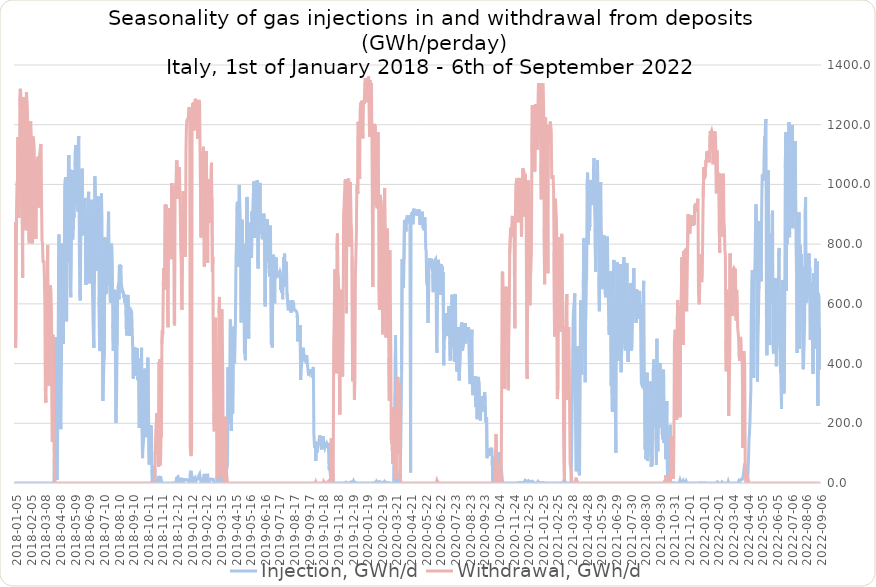
| Category | Injection, GWh/d | Withdrawal, GWh/d |
|---|---|---|
| 2022-09-06 | 522 | 0 |
| 2022-09-05 | 380.31 | 0 |
| 2022-09-04 | 624.36 | 0 |
| 2022-09-03 | 636.69 | 0 |
| 2022-09-02 | 258.62 | 0 |
| 2022-09-01 | 741.74 | 0 |
| 2022-08-31 | 582.03 | 0 |
| 2022-08-30 | 633.62 | 0 |
| 2022-08-29 | 450.82 | 0 |
| 2022-08-28 | 751.25 | 0 |
| 2022-08-27 | 535.9 | 0 |
| 2022-08-26 | 509.53 | 1.1 |
| 2022-08-25 | 571.39 | 0 |
| 2022-08-24 | 702.57 | 0 |
| 2022-08-23 | 365.87 | 0 |
| 2022-08-22 | 397.51 | 0 |
| 2022-08-21 | 633.88 | 0 |
| 2022-08-20 | 581.63 | 0 |
| 2022-08-19 | 671.22 | 0 |
| 2022-08-18 | 580.53 | 0 |
| 2022-08-17 | 478.66 | 0 |
| 2022-08-16 | 720.75 | 0 |
| 2022-08-15 | 712.52 | 0 |
| 2022-08-14 | 768.39 | 0 |
| 2022-08-13 | 723.56 | 0 |
| 2022-08-12 | 624.71 | 0 |
| 2022-08-11 | 649.97 | 0 |
| 2022-08-10 | 647.17 | 0 |
| 2022-08-09 | 604.51 | 0 |
| 2022-08-08 | 691.4 | 0 |
| 2022-08-07 | 958.04 | 0 |
| 2022-08-06 | 883.06 | 0 |
| 2022-08-05 | 542.07 | 0 |
| 2022-08-04 | 482.61 | 0 |
| 2022-08-03 | 411.33 | 0 |
| 2022-08-02 | 381.16 | 0 |
| 2022-08-01 | 379.88 | 0 |
| 2022-07-31 | 726.8 | 0 |
| 2022-07-30 | 688.19 | 0 |
| 2022-07-29 | 765.94 | 0 |
| 2022-07-28 | 726.4 | 0 |
| 2022-07-27 | 797 | 0 |
| 2022-07-26 | 597.26 | 0 |
| 2022-07-25 | 449.09 | 0 |
| 2022-07-24 | 905.76 | 0 |
| 2022-07-23 | 864.1 | 0 |
| 2022-07-22 | 742.27 | 0 |
| 2022-07-21 | 616.97 | 0 |
| 2022-07-20 | 435.09 | 0 |
| 2022-07-19 | 676.32 | 0 |
| 2022-07-18 | 780.24 | 0 |
| 2022-07-17 | 966.57 | 0 |
| 2022-07-16 | 1145.57 | 0 |
| 2022-07-15 | 958.63 | 0 |
| 2022-07-14 | 894.74 | 0 |
| 2022-07-13 | 972.17 | 0 |
| 2022-07-12 | 957.56 | 0 |
| 2022-07-11 | 852.85 | 0 |
| 2022-07-10 | 1198.65 | 0 |
| 2022-07-09 | 1179.16 | 0 |
| 2022-07-08 | 1036.65 | 0 |
| 2022-07-07 | 944.15 | 0 |
| 2022-07-06 | 1006.03 | 0 |
| 2022-07-05 | 913.81 | 0 |
| 2022-07-04 | 823.46 | 0 |
| 2022-07-03 | 1207.93 | 0 |
| 2022-07-02 | 1136.13 | 0 |
| 2022-07-01 | 1175.84 | 0 |
| 2022-06-30 | 918.83 | 0 |
| 2022-06-29 | 801.55 | 0 |
| 2022-06-28 | 891.05 | 0 |
| 2022-06-27 | 644.27 | 0 |
| 2022-06-26 | 1173.8 | 0 |
| 2022-06-25 | 1055.33 | 0 |
| 2022-06-24 | 665.55 | 0 |
| 2022-06-23 | 312.2 | 0 |
| 2022-06-22 | 299.56 | 0 |
| 2022-06-21 | 322.4 | 0 |
| 2022-06-20 | 308.31 | 0 |
| 2022-06-19 | 680.13 | 0 |
| 2022-06-18 | 605.88 | 0 |
| 2022-06-17 | 248.25 | 0 |
| 2022-06-16 | 375.16 | 0 |
| 2022-06-15 | 368.04 | 0 |
| 2022-06-14 | 423.47 | 0 |
| 2022-06-13 | 460.24 | 0 |
| 2022-06-12 | 787.29 | 0 |
| 2022-06-11 | 759.45 | 0 |
| 2022-06-10 | 483.1 | 0 |
| 2022-06-09 | 471.76 | 0 |
| 2022-06-08 | 503.98 | 0 |
| 2022-06-07 | 491 | 0 |
| 2022-06-06 | 391.42 | 0 |
| 2022-06-05 | 686.17 | 0 |
| 2022-06-04 | 648.58 | 0 |
| 2022-06-03 | 531.03 | 0 |
| 2022-06-02 | 682.45 | 0 |
| 2022-06-01 | 454.23 | 0 |
| 2022-05-31 | 433.34 | 0 |
| 2022-05-30 | 475.37 | 0 |
| 2022-05-29 | 911.99 | 0 |
| 2022-05-28 | 888.42 | 0 |
| 2022-05-27 | 600.42 | 0 |
| 2022-05-26 | 837.64 | 0 |
| 2022-05-25 | 735.14 | 0 |
| 2022-05-24 | 651.69 | 0 |
| 2022-05-23 | 462.14 | 0 |
| 2022-05-22 | 718.76 | 0 |
| 2022-05-21 | 647.62 | 0 |
| 2022-05-20 | 1046.3 | 0 |
| 2022-05-19 | 1023.28 | 0 |
| 2022-05-18 | 492.04 | 0 |
| 2022-05-17 | 428.08 | 0 |
| 2022-05-16 | 572.08 | 0 |
| 2022-05-15 | 1219.17 | 0 |
| 2022-05-14 | 1201.79 | 0 |
| 2022-05-13 | 1142.67 | 0 |
| 2022-05-12 | 1160.33 | 0 |
| 2022-05-11 | 1031.69 | 0 |
| 2022-05-10 | 1012.99 | 0 |
| 2022-05-09 | 1027.37 | 0 |
| 2022-05-08 | 1034.96 | 0 |
| 2022-05-07 | 1027.22 | 0 |
| 2022-05-06 | 932.66 | 0 |
| 2022-05-05 | 675.63 | 0 |
| 2022-05-04 | 769.76 | 0 |
| 2022-05-03 | 709.38 | 0 |
| 2022-05-02 | 770.95 | 0 |
| 2022-05-01 | 876.31 | 0 |
| 2022-04-30 | 647.91 | 0 |
| 2022-04-29 | 549.84 | 0 |
| 2022-04-28 | 477.53 | 0 |
| 2022-04-27 | 340.17 | 0 |
| 2022-04-26 | 549.24 | 0 |
| 2022-04-25 | 876.72 | 0 |
| 2022-04-24 | 933.18 | 0 |
| 2022-04-23 | 884.8 | 0 |
| 2022-04-22 | 752.79 | 0 |
| 2022-04-21 | 698.81 | 0 |
| 2022-04-20 | 674.97 | 0 |
| 2022-04-19 | 352.06 | 0 |
| 2022-04-18 | 681.2 | 0 |
| 2022-04-17 | 706.93 | 0 |
| 2022-04-16 | 713.17 | 0 |
| 2022-04-15 | 609.02 | 0 |
| 2022-04-14 | 591.31 | 0 |
| 2022-04-13 | 316.67 | 0 |
| 2022-04-12 | 319.54 | 0 |
| 2022-04-11 | 202.72 | 0 |
| 2022-04-10 | 165.56 | 0 |
| 2022-04-09 | 145.06 | 0 |
| 2022-04-08 | 78.04 | 0 |
| 2022-04-07 | 41.65 | 0.7 |
| 2022-04-06 | 5.99 | 20.3 |
| 2022-04-05 | 3.56 | 21.5 |
| 2022-04-04 | 4.31 | 14.7 |
| 2022-04-03 | 17.87 | 0 |
| 2022-04-02 | 18.01 | 0 |
| 2022-04-01 | 17.82 | 41.8 |
| 2022-03-31 | 64.68 | 385.8 |
| 2022-03-30 | 55.08 | 431.6 |
| 2022-03-29 | 53.65 | 442 |
| 2022-03-28 | 26.47 | 398.6 |
| 2022-03-27 | 29.78 | 117.3 |
| 2022-03-26 | 12.37 | 391.5 |
| 2022-03-25 | 9.67 | 391.5 |
| 2022-03-24 | 11.98 | 432.4 |
| 2022-03-23 | 11.96 | 483.3 |
| 2022-03-22 | 14.81 | 489.2 |
| 2022-03-21 | 3.99 | 488.2 |
| 2022-03-20 | 13.81 | 410.1 |
| 2022-03-19 | 13.81 | 436.3 |
| 2022-03-18 | 3 | 485.6 |
| 2022-03-17 | 0 | 503.7 |
| 2022-03-16 | 0 | 521 |
| 2022-03-15 | 0 | 621.7 |
| 2022-03-14 | 0 | 646.9 |
| 2022-03-13 | 0 | 544 |
| 2022-03-12 | 0 | 626.2 |
| 2022-03-11 | 0 | 717.5 |
| 2022-03-10 | 0 | 641.2 |
| 2022-03-09 | 0 | 717 |
| 2022-03-08 | 0 | 720.4 |
| 2022-03-07 | 0 | 717 |
| 2022-03-06 | 0 | 563.6 |
| 2022-03-05 | 0 | 559.5 |
| 2022-03-04 | 0 | 660.1 |
| 2022-03-03 | 0 | 667.8 |
| 2022-03-02 | 0 | 621.3 |
| 2022-03-01 | 0 | 607.7 |
| 2022-02-28 | 0 | 768.4 |
| 2022-02-27 | 0 | 413.9 |
| 2022-02-26 | 0 | 293.4 |
| 2022-02-25 | 0 | 224.2 |
| 2022-02-24 | 5.29 | 612.8 |
| 2022-02-23 | 0 | 592.5 |
| 2022-02-22 | 0 | 612.4 |
| 2022-02-21 | 0 | 647.6 |
| 2022-02-20 | 0 | 374.1 |
| 2022-02-19 | 0 | 476.8 |
| 2022-02-18 | 0 | 763 |
| 2022-02-17 | 0 | 778.5 |
| 2022-02-16 | 0 | 854.4 |
| 2022-02-15 | 0 | 875.6 |
| 2022-02-14 | 0 | 1035.5 |
| 2022-02-13 | 0 | 823.8 |
| 2022-02-12 | 0 | 855.6 |
| 2022-02-11 | 3.66 | 888.6 |
| 2022-02-10 | 0 | 967 |
| 2022-02-09 | 0 | 986.4 |
| 2022-02-08 | 0 | 1036.2 |
| 2022-02-07 | 0 | 1030.8 |
| 2022-02-06 | 0 | 770.5 |
| 2022-02-05 | 0.1 | 863.4 |
| 2022-02-04 | 0 | 987.6 |
| 2022-02-03 | 0 | 1023 |
| 2022-02-02 | 0 | 1041.1 |
| 2022-02-01 | 4.08 | 994 |
| 2022-01-31 | 2.27 | 1113.7 |
| 2022-01-30 | 0.27 | 970.2 |
| 2022-01-29 | 0 | 1103.8 |
| 2022-01-28 | 0 | 1160.2 |
| 2022-01-27 | 0 | 1176.8 |
| 2022-01-26 | 0 | 1162.4 |
| 2022-01-25 | 0 | 1176.6 |
| 2022-01-24 | 0 | 1168.9 |
| 2022-01-23 | 0 | 1067.5 |
| 2022-01-22 | 0 | 1161 |
| 2022-01-21 | 0 | 1173.8 |
| 2022-01-20 | 0 | 1180.5 |
| 2022-01-19 | 0 | 1175.9 |
| 2022-01-18 | 0 | 1168.7 |
| 2022-01-17 | 0 | 1178.8 |
| 2022-01-16 | 0 | 1123.1 |
| 2022-01-15 | 0 | 1073.9 |
| 2022-01-14 | 0 | 1111.5 |
| 2022-01-13 | 0 | 1107.9 |
| 2022-01-12 | 0 | 1111.5 |
| 2022-01-11 | 0 | 1074.8 |
| 2022-01-10 | 0 | 1110.3 |
| 2022-01-09 | 0.27 | 1073.5 |
| 2022-01-08 | 0.27 | 1082.2 |
| 2022-01-07 | 0 | 1081.8 |
| 2022-01-06 | 1.11 | 1024.8 |
| 2022-01-05 | 1.91 | 1027.2 |
| 2022-01-04 | 1.59 | 1017.7 |
| 2022-01-03 | 0.82 | 1057.3 |
| 2022-01-02 | 1.18 | 957.3 |
| 2022-01-01 | 1.18 | 832.2 |
| 2021-12-31 | 0.91 | 692.6 |
| 2021-12-30 | 0.91 | 673 |
| 2021-12-29 | 0.27 | 684.4 |
| 2021-12-28 | 0.27 | 766.5 |
| 2021-12-27 | 0.27 | 689 |
| 2021-12-26 | 1.34 | 759.9 |
| 2021-12-25 | 1.34 | 599 |
| 2021-12-24 | 0 | 608.6 |
| 2021-12-23 | 0 | 637.3 |
| 2021-12-22 | 0 | 952.2 |
| 2021-12-21 | 0 | 942.5 |
| 2021-12-20 | 0 | 939.9 |
| 2021-12-19 | 0 | 920.5 |
| 2021-12-18 | 0 | 908.2 |
| 2021-12-17 | 0 | 937 |
| 2021-12-16 | 0 | 924.3 |
| 2021-12-15 | 0 | 931.9 |
| 2021-12-14 | 0 | 865.3 |
| 2021-12-13 | 0 | 877.4 |
| 2021-12-12 | 0 | 861.3 |
| 2021-12-11 | 0 | 874.4 |
| 2021-12-10 | 0 | 875 |
| 2021-12-09 | 0 | 897.3 |
| 2021-12-08 | 0 | 891.8 |
| 2021-12-07 | 0 | 885.9 |
| 2021-12-06 | 0 | 887.8 |
| 2021-12-05 | 0 | 835.1 |
| 2021-12-04 | 0 | 843.8 |
| 2021-12-03 | 0 | 881.5 |
| 2021-12-02 | 0 | 887.8 |
| 2021-12-01 | 0 | 900.4 |
| 2021-11-30 | 0 | 793.6 |
| 2021-11-29 | 0 | 790.7 |
| 2021-11-28 | 0 | 575.1 |
| 2021-11-27 | 4.71 | 634.4 |
| 2021-11-26 | 0 | 782.1 |
| 2021-11-25 | 0 | 781.6 |
| 2021-11-24 | 0 | 778.6 |
| 2021-11-23 | 0.96 | 692.2 |
| 2021-11-22 | 0 | 777 |
| 2021-11-21 | 7.98 | 462.5 |
| 2021-11-20 | 6.08 | 577.9 |
| 2021-11-19 | 0.38 | 649 |
| 2021-11-18 | 0 | 757.1 |
| 2021-11-17 | 3.28 | 677.1 |
| 2021-11-16 | 2.32 | 583.5 |
| 2021-11-15 | 0 | 591.5 |
| 2021-11-14 | 11.24 | 220.6 |
| 2021-11-13 | 11.51 | 284.1 |
| 2021-11-12 | 0 | 574.3 |
| 2021-11-11 | 0 | 515.8 |
| 2021-11-10 | 0 | 583.4 |
| 2021-11-09 | 0 | 612.2 |
| 2021-11-08 | 0 | 541.4 |
| 2021-11-07 | 0.22 | 211.4 |
| 2021-11-06 | 0.31 | 394.8 |
| 2021-11-05 | 0 | 497.7 |
| 2021-11-04 | 0 | 513.1 |
| 2021-11-03 | 0 | 505.3 |
| 2021-11-02 | 0 | 476 |
| 2021-11-01 | 0 | 161 |
| 2021-10-31 | 1.44 | 14.2 |
| 2021-10-30 | 0 | 33.8 |
| 2021-10-29 | 0 | 52.5 |
| 2021-10-28 | 0 | 129 |
| 2021-10-27 | 0 | 155.2 |
| 2021-10-26 | 0 | 73.7 |
| 2021-10-25 | 1.7 | 38.3 |
| 2021-10-24 | 195.16 | 0 |
| 2021-10-23 | 110.77 | 0 |
| 2021-10-22 | 19.05 | 21.1 |
| 2021-10-21 | 81.2 | 32.3 |
| 2021-10-20 | 89.6 | 2 |
| 2021-10-19 | 7.23 | 12.7 |
| 2021-10-18 | 55.84 | 10.4 |
| 2021-10-17 | 273.95 | 0 |
| 2021-10-16 | 182.82 | 0 |
| 2021-10-15 | 79.87 | 26 |
| 2021-10-14 | 126.73 | 1.6 |
| 2021-10-13 | 151.31 | 8.3 |
| 2021-10-12 | 160.24 | 0.4 |
| 2021-10-11 | 134.18 | 1.5 |
| 2021-10-10 | 379.34 | 0 |
| 2021-10-09 | 364.79 | 0 |
| 2021-10-08 | 146.82 | 0 |
| 2021-10-07 | 176.38 | 0 |
| 2021-10-06 | 196.42 | 0 |
| 2021-10-05 | 229.56 | 0 |
| 2021-10-04 | 223.14 | 0 |
| 2021-10-03 | 402.26 | 0 |
| 2021-10-02 | 395.65 | 0 |
| 2021-10-01 | 185.43 | 0 |
| 2021-09-30 | 243.85 | 0 |
| 2021-09-29 | 188.39 | 0 |
| 2021-09-28 | 106.46 | 0 |
| 2021-09-27 | 192.12 | 0 |
| 2021-09-26 | 483.15 | 0 |
| 2021-09-25 | 61.2 | 0 |
| 2021-09-24 | 172.04 | 0 |
| 2021-09-23 | 175.25 | 0 |
| 2021-09-22 | 207.51 | 0 |
| 2021-09-21 | 195.39 | 0 |
| 2021-09-20 | 238.26 | 0 |
| 2021-09-19 | 413.63 | 0 |
| 2021-09-18 | 358.89 | 0 |
| 2021-09-17 | 213.53 | 0 |
| 2021-09-16 | 58.81 | 0 |
| 2021-09-15 | 93.08 | 0 |
| 2021-09-14 | 54.81 | 0 |
| 2021-09-13 | 117.66 | 0 |
| 2021-09-12 | 340.15 | 0 |
| 2021-09-11 | 239.54 | 0 |
| 2021-09-10 | 206.15 | 0 |
| 2021-09-09 | 196.26 | 0 |
| 2021-09-08 | 122.48 | 0 |
| 2021-09-07 | 135.62 | 0 |
| 2021-09-06 | 73.32 | 0 |
| 2021-09-05 | 369.38 | 0 |
| 2021-09-04 | 237.19 | 0 |
| 2021-09-03 | 79.65 | 0 |
| 2021-09-02 | 147.11 | 0 |
| 2021-09-01 | 112.2 | 0 |
| 2021-08-31 | 273.09 | 0 |
| 2021-08-30 | 398.95 | 0 |
| 2021-08-29 | 677.02 | 0 |
| 2021-08-28 | 631.49 | 0 |
| 2021-08-27 | 463.57 | 0 |
| 2021-08-26 | 336.62 | 0 |
| 2021-08-25 | 328.91 | 0 |
| 2021-08-24 | 333.06 | 0 |
| 2021-08-23 | 430.81 | 0 |
| 2021-08-22 | 589.59 | 0 |
| 2021-08-21 | 597.32 | 0 |
| 2021-08-20 | 643.47 | 0 |
| 2021-08-19 | 553.91 | 0 |
| 2021-08-18 | 562.1 | 0 |
| 2021-08-17 | 577.86 | 0 |
| 2021-08-16 | 551.13 | 0 |
| 2021-08-15 | 578.45 | 0 |
| 2021-08-14 | 647.87 | 0 |
| 2021-08-13 | 535.66 | 0 |
| 2021-08-12 | 572.21 | 0 |
| 2021-08-11 | 648.22 | 0 |
| 2021-08-10 | 614.59 | 0 |
| 2021-08-09 | 574.22 | 0 |
| 2021-08-08 | 719.89 | 0 |
| 2021-08-07 | 718.74 | 0 |
| 2021-08-06 | 612.88 | 0 |
| 2021-08-05 | 533.25 | 0 |
| 2021-08-04 | 453.83 | 0 |
| 2021-08-03 | 443.29 | 0 |
| 2021-08-02 | 507.28 | 0 |
| 2021-08-01 | 668.91 | 0 |
| 2021-07-31 | 642.32 | 0 |
| 2021-07-30 | 515.23 | 0 |
| 2021-07-29 | 504.64 | 0 |
| 2021-07-28 | 525.61 | 0 |
| 2021-07-27 | 406.15 | 0 |
| 2021-07-26 | 447.69 | 0 |
| 2021-07-25 | 736.04 | 0 |
| 2021-07-24 | 732.49 | 0 |
| 2021-07-23 | 502.89 | 0 |
| 2021-07-22 | 448.2 | 0 |
| 2021-07-21 | 444.4 | 0 |
| 2021-07-20 | 461.4 | 0 |
| 2021-07-19 | 470.61 | 0 |
| 2021-07-18 | 756.44 | 0 |
| 2021-07-17 | 649.35 | 0 |
| 2021-07-16 | 499.47 | 0 |
| 2021-07-15 | 498.1 | 0 |
| 2021-07-14 | 489.96 | 0 |
| 2021-07-13 | 422.14 | 0 |
| 2021-07-12 | 371.11 | 0 |
| 2021-07-11 | 732.6 | 0 |
| 2021-07-10 | 683.09 | 0 |
| 2021-07-09 | 458.2 | 0 |
| 2021-07-08 | 460.97 | 0 |
| 2021-07-07 | 408.84 | 0 |
| 2021-07-06 | 460.83 | 0 |
| 2021-07-05 | 514.11 | 0 |
| 2021-07-04 | 739.17 | 0 |
| 2021-07-03 | 705.9 | 0 |
| 2021-07-02 | 498.06 | 0 |
| 2021-07-01 | 101.1 | 0 |
| 2021-06-30 | 233.1 | 0 |
| 2021-06-29 | 390.23 | 0 |
| 2021-06-28 | 471.65 | 0 |
| 2021-06-27 | 747.22 | 0 |
| 2021-06-26 | 684.96 | 0 |
| 2021-06-25 | 349.77 | 0 |
| 2021-06-24 | 238.27 | 0 |
| 2021-06-23 | 245.69 | 0 |
| 2021-06-22 | 350.85 | 0 |
| 2021-06-21 | 326.86 | 0 |
| 2021-06-20 | 709.55 | 0 |
| 2021-06-19 | 671.18 | 0 |
| 2021-06-18 | 569.07 | 0 |
| 2021-06-17 | 495.95 | 0 |
| 2021-06-16 | 525.26 | 0 |
| 2021-06-15 | 619.91 | 0 |
| 2021-06-14 | 704.49 | 0 |
| 2021-06-13 | 825.17 | 0 |
| 2021-06-12 | 823.88 | 0 |
| 2021-06-11 | 765.71 | 0 |
| 2021-06-10 | 729.72 | 0 |
| 2021-06-09 | 621.99 | 0 |
| 2021-06-08 | 660.52 | 0 |
| 2021-06-07 | 653.66 | 0 |
| 2021-06-06 | 829.24 | 0 |
| 2021-06-05 | 711.6 | 0 |
| 2021-06-04 | 695.9 | 0 |
| 2021-06-03 | 707.85 | 0 |
| 2021-06-02 | 801.24 | 0 |
| 2021-06-01 | 649.34 | 0 |
| 2021-05-31 | 844.08 | 0 |
| 2021-05-30 | 1006.89 | 0 |
| 2021-05-29 | 995.54 | 0 |
| 2021-05-28 | 762.8 | 0 |
| 2021-05-27 | 575.35 | 0 |
| 2021-05-26 | 688.82 | 0 |
| 2021-05-25 | 902.34 | 0 |
| 2021-05-24 | 892.24 | 0 |
| 2021-05-23 | 1079.91 | 0 |
| 2021-05-22 | 1082.45 | 0 |
| 2021-05-21 | 907 | 0 |
| 2021-05-20 | 923.9 | 0 |
| 2021-05-19 | 708 | 0 |
| 2021-05-18 | 851.64 | 0 |
| 2021-05-17 | 922.87 | 0 |
| 2021-05-16 | 1088.08 | 0 |
| 2021-05-15 | 1080.36 | 0 |
| 2021-05-14 | 989.6 | 0 |
| 2021-05-13 | 942.53 | 0 |
| 2021-05-12 | 939.98 | 0 |
| 2021-05-11 | 931.14 | 0 |
| 2021-05-10 | 941.33 | 0 |
| 2021-05-09 | 1014.95 | 0 |
| 2021-05-08 | 988.77 | 0 |
| 2021-05-07 | 858.45 | 0 |
| 2021-05-06 | 867.45 | 0 |
| 2021-05-05 | 844.56 | 0 |
| 2021-05-04 | 891.61 | 0 |
| 2021-05-03 | 799.12 | 0 |
| 2021-05-02 | 1038.85 | 0 |
| 2021-05-01 | 984.54 | 0 |
| 2021-04-30 | 678.63 | 0 |
| 2021-04-29 | 713.77 | 0 |
| 2021-04-28 | 552.94 | 0 |
| 2021-04-27 | 337.17 | 0 |
| 2021-04-26 | 572.75 | 0 |
| 2021-04-25 | 806.58 | 0 |
| 2021-04-24 | 819.98 | 0 |
| 2021-04-23 | 657.1 | 0 |
| 2021-04-22 | 523.94 | 0 |
| 2021-04-21 | 446.25 | 0 |
| 2021-04-20 | 363.45 | 0 |
| 2021-04-19 | 374.84 | 0 |
| 2021-04-18 | 611.61 | 0 |
| 2021-04-17 | 586.67 | 0 |
| 2021-04-16 | 267.06 | 0 |
| 2021-04-15 | 25.61 | 0 |
| 2021-04-14 | 37.82 | 0 |
| 2021-04-13 | 121.11 | 0 |
| 2021-04-12 | 213.9 | 0 |
| 2021-04-11 | 458.96 | 0 |
| 2021-04-10 | 91.39 | 0 |
| 2021-04-09 | 73.73 | 8.9 |
| 2021-04-08 | 39.05 | 17.7 |
| 2021-04-07 | 39.05 | 17.4 |
| 2021-04-06 | 361.47 | 0 |
| 2021-04-05 | 635.01 | 0 |
| 2021-04-04 | 611.1 | 0 |
| 2021-04-03 | 611.22 | 0 |
| 2021-04-02 | 573.21 | 0 |
| 2021-04-01 | 518.97 | 0 |
| 2021-03-31 | 314.04 | 0 |
| 2021-03-30 | 221.68 | 0 |
| 2021-03-29 | 75.39 | 9.6 |
| 2021-03-28 | 3.16 | 41.7 |
| 2021-03-27 | 1.98 | 41.7 |
| 2021-03-26 | 0 | 65.7 |
| 2021-03-25 | 0 | 229.9 |
| 2021-03-24 | 0 | 441.5 |
| 2021-03-23 | 0 | 522.6 |
| 2021-03-22 | 0 | 521.1 |
| 2021-03-21 | 0 | 278.6 |
| 2021-03-20 | 0 | 485.6 |
| 2021-03-19 | 0 | 632.6 |
| 2021-03-18 | 0 | 539.1 |
| 2021-03-17 | 0 | 473.2 |
| 2021-03-16 | 0 | 525.7 |
| 2021-03-15 | 0 | 478.5 |
| 2021-03-14 | 13.61 | 5.2 |
| 2021-03-13 | 15.2 | 7.1 |
| 2021-03-12 | 1.77 | 216 |
| 2021-03-11 | 1.91 | 581.2 |
| 2021-03-10 | 1.03 | 621.1 |
| 2021-03-09 | 0 | 827.6 |
| 2021-03-08 | 0 | 834.4 |
| 2021-03-07 | 0.55 | 506.8 |
| 2021-03-06 | 0.55 | 524 |
| 2021-03-05 | 0.24 | 675.2 |
| 2021-03-04 | 0 | 818.9 |
| 2021-03-03 | 0 | 813.5 |
| 2021-03-02 | 0 | 819.2 |
| 2021-03-01 | 0 | 822.6 |
| 2021-02-28 | 0.5 | 311.2 |
| 2021-02-27 | 0.49 | 281.1 |
| 2021-02-26 | 0 | 771.4 |
| 2021-02-25 | 0 | 883.7 |
| 2021-02-24 | 0 | 914.3 |
| 2021-02-23 | 0 | 952.2 |
| 2021-02-22 | 0 | 916.4 |
| 2021-02-21 | 0.04 | 491 |
| 2021-02-20 | 0 | 773.2 |
| 2021-02-19 | 0 | 983.4 |
| 2021-02-18 | 0 | 1025.6 |
| 2021-02-17 | 0 | 1024.3 |
| 2021-02-16 | 0 | 1025.1 |
| 2021-02-15 | 0 | 1024.1 |
| 2021-02-14 | 0 | 1182.1 |
| 2021-02-13 | 0 | 1196.9 |
| 2021-02-12 | 0 | 1210.4 |
| 2021-02-11 | 0 | 1148.4 |
| 2021-02-10 | 0 | 1174.2 |
| 2021-02-09 | 0 | 1199.3 |
| 2021-02-08 | 0 | 1155.9 |
| 2021-02-07 | 0.55 | 702.4 |
| 2021-02-06 | 0.55 | 703.6 |
| 2021-02-05 | 0 | 1132.8 |
| 2021-02-04 | 0 | 1128.1 |
| 2021-02-03 | 0.29 | 1118.1 |
| 2021-02-02 | 0 | 1225.3 |
| 2021-02-01 | 0.39 | 1204.4 |
| 2021-01-31 | 0.76 | 665.3 |
| 2021-01-30 | 0.76 | 855.8 |
| 2021-01-29 | 1.78 | 1245 |
| 2021-01-28 | 0.86 | 1317.5 |
| 2021-01-27 | 0 | 1339.1 |
| 2021-01-26 | 0.7 | 1228.9 |
| 2021-01-25 | 0.53 | 1248.8 |
| 2021-01-24 | 1.78 | 950.6 |
| 2021-01-23 | 1.64 | 1072.9 |
| 2021-01-22 | 2.09 | 1228.2 |
| 2021-01-21 | 0 | 1339.6 |
| 2021-01-20 | 0 | 1312.1 |
| 2021-01-19 | 0 | 1307.6 |
| 2021-01-18 | 0 | 1339.5 |
| 2021-01-17 | 5.23 | 1220.2 |
| 2021-01-16 | 4.64 | 1116.8 |
| 2021-01-15 | 0 | 1264.6 |
| 2021-01-14 | 0 | 1264.8 |
| 2021-01-13 | 0.2 | 1220.6 |
| 2021-01-12 | 0 | 1269.1 |
| 2021-01-11 | 0 | 1271.3 |
| 2021-01-10 | 0.96 | 1043.6 |
| 2021-01-09 | 0.5 | 1169.7 |
| 2021-01-08 | 0.9 | 1180.5 |
| 2021-01-07 | 0 | 1265.8 |
| 2021-01-06 | 4.49 | 1111.6 |
| 2021-01-05 | 0 | 1264 |
| 2021-01-04 | 4.87 | 1105 |
| 2021-01-03 | 3.75 | 773.6 |
| 2021-01-02 | 3.75 | 727.7 |
| 2021-01-01 | 3.03 | 682.9 |
| 2020-12-31 | 4.84 | 595.5 |
| 2020-12-30 | 4.9 | 799.3 |
| 2020-12-29 | 6.73 | 957.1 |
| 2020-12-28 | 2.87 | 1012.8 |
| 2020-12-27 | 6.42 | 871.2 |
| 2020-12-26 | 6.42 | 637.6 |
| 2020-12-25 | 7.18 | 348.5 |
| 2020-12-24 | 7.13 | 426.1 |
| 2020-12-23 | 5.29 | 889.6 |
| 2020-12-22 | 2.09 | 1002.2 |
| 2020-12-21 | 5.32 | 1035.7 |
| 2020-12-20 | 7.44 | 892.8 |
| 2020-12-19 | 7 | 960.1 |
| 2020-12-18 | 1.52 | 1044.8 |
| 2020-12-17 | 1.01 | 1034.5 |
| 2020-12-16 | 0.25 | 1053.6 |
| 2020-12-15 | 1.35 | 949.5 |
| 2020-12-14 | 0 | 1007.9 |
| 2020-12-13 | 2.46 | 825.5 |
| 2020-12-12 | 2.2 | 988.2 |
| 2020-12-11 | 1.96 | 1002.1 |
| 2020-12-10 | 1.08 | 1002.1 |
| 2020-12-09 | 0.05 | 1021.8 |
| 2020-12-08 | 0.05 | 1005.9 |
| 2020-12-07 | 0 | 1015.6 |
| 2020-12-06 | 1.88 | 873.5 |
| 2020-12-05 | 0.28 | 924.7 |
| 2020-12-04 | 0 | 1021.1 |
| 2020-12-03 | 0 | 1021 |
| 2020-12-02 | 0 | 1009.9 |
| 2020-12-01 | 0 | 997.1 |
| 2020-11-30 | 0 | 883.1 |
| 2020-11-29 | 0 | 518.5 |
| 2020-11-28 | 0 | 712.4 |
| 2020-11-27 | 0 | 893.1 |
| 2020-11-26 | 0 | 893.6 |
| 2020-11-25 | 0 | 884.9 |
| 2020-11-24 | 0 | 894.3 |
| 2020-11-23 | 0 | 887.7 |
| 2020-11-22 | 0 | 835.5 |
| 2020-11-21 | 0 | 823.5 |
| 2020-11-20 | 0 | 854.7 |
| 2020-11-19 | 0 | 854.4 |
| 2020-11-18 | 0 | 767.3 |
| 2020-11-17 | 0 | 559.2 |
| 2020-11-16 | 0 | 486.2 |
| 2020-11-15 | 0 | 310.6 |
| 2020-11-14 | 0 | 423.8 |
| 2020-11-13 | 0 | 605.9 |
| 2020-11-12 | 0 | 652.7 |
| 2020-11-11 | 0 | 642.5 |
| 2020-11-10 | 0 | 657.1 |
| 2020-11-09 | 0 | 582.8 |
| 2020-11-08 | 1.41 | 322 |
| 2020-11-07 | 1.59 | 315 |
| 2020-11-06 | 0 | 453.3 |
| 2020-11-05 | 0 | 629.8 |
| 2020-11-04 | 0 | 580.6 |
| 2020-11-03 | 0 | 707.7 |
| 2020-11-02 | 0 | 699.8 |
| 2020-11-01 | 1.74 | 334.9 |
| 2020-10-31 | 52.21 | 0 |
| 2020-10-30 | 14.25 | 15.2 |
| 2020-10-29 | 0 | 69.7 |
| 2020-10-28 | 0 | 37.5 |
| 2020-10-27 | 0 | 31.3 |
| 2020-10-26 | 102.72 | 0.4 |
| 2020-10-25 | 37.31 | 0 |
| 2020-10-24 | 34.2 | 0 |
| 2020-10-23 | 31.78 | 16.1 |
| 2020-10-22 | 24.51 | 23.5 |
| 2020-10-21 | 0 | 23.7 |
| 2020-10-20 | 0 | 164.3 |
| 2020-10-19 | 1.59 | 20.3 |
| 2020-10-18 | 90.07 | 0 |
| 2020-10-17 | 85.04 | 0 |
| 2020-10-16 | 45.95 | 0 |
| 2020-10-15 | 55.91 | 0 |
| 2020-10-14 | 29.78 | 0 |
| 2020-10-13 | 5.34 | 3.1 |
| 2020-10-12 | 80.41 | 0 |
| 2020-10-11 | 118.26 | 0 |
| 2020-10-10 | 114.73 | 0 |
| 2020-10-09 | 113.79 | 0 |
| 2020-10-08 | 108.03 | 0 |
| 2020-10-07 | 102.35 | 0 |
| 2020-10-06 | 103.41 | 0 |
| 2020-10-05 | 90.25 | 0 |
| 2020-10-04 | 115.68 | 0 |
| 2020-10-03 | 116.31 | 0 |
| 2020-10-02 | 105.89 | 0 |
| 2020-10-01 | 83.19 | 0 |
| 2020-09-30 | 219.74 | 0 |
| 2020-09-29 | 203.37 | 0 |
| 2020-09-28 | 219.24 | 0 |
| 2020-09-27 | 288.89 | 0 |
| 2020-09-26 | 303.99 | 0 |
| 2020-09-25 | 289.85 | 0 |
| 2020-09-24 | 261.69 | 0 |
| 2020-09-23 | 254.26 | 0 |
| 2020-09-22 | 237.85 | 0 |
| 2020-09-21 | 282.01 | 0 |
| 2020-09-20 | 290.08 | 0 |
| 2020-09-19 | 267.85 | 0 |
| 2020-09-18 | 257.85 | 0 |
| 2020-09-17 | 209.02 | 0 |
| 2020-09-16 | 225.69 | 0 |
| 2020-09-15 | 220.27 | 0 |
| 2020-09-14 | 335.88 | 0 |
| 2020-09-13 | 350.22 | 0 |
| 2020-09-12 | 355.41 | 0 |
| 2020-09-11 | 270.22 | 0 |
| 2020-09-10 | 213.81 | 0 |
| 2020-09-09 | 293.34 | 0 |
| 2020-09-08 | 269.61 | 0 |
| 2020-09-07 | 254.25 | 0 |
| 2020-09-06 | 357.27 | 0 |
| 2020-09-05 | 354.49 | 0 |
| 2020-09-04 | 345.28 | 0 |
| 2020-09-03 | 329.59 | 0 |
| 2020-09-02 | 299 | 0 |
| 2020-09-01 | 294.28 | 0 |
| 2020-08-31 | 318.15 | 0 |
| 2020-08-30 | 513.58 | 0 |
| 2020-08-29 | 479.19 | 0 |
| 2020-08-28 | 364.67 | 0 |
| 2020-08-27 | 341.16 | 0 |
| 2020-08-26 | 331.38 | 0 |
| 2020-08-25 | 360.03 | 0 |
| 2020-08-24 | 431.82 | 0 |
| 2020-08-23 | 521.99 | 0 |
| 2020-08-22 | 513.95 | 0 |
| 2020-08-21 | 519.46 | 0 |
| 2020-08-20 | 497.22 | 0 |
| 2020-08-19 | 514.46 | 0 |
| 2020-08-18 | 504.74 | 0 |
| 2020-08-17 | 467.36 | 0 |
| 2020-08-16 | 535.61 | 0 |
| 2020-08-15 | 536.38 | 0 |
| 2020-08-14 | 512.92 | 0 |
| 2020-08-13 | 500.88 | 0 |
| 2020-08-12 | 460.43 | 0 |
| 2020-08-11 | 462.87 | 0 |
| 2020-08-10 | 444.02 | 0 |
| 2020-08-09 | 537.43 | 0 |
| 2020-08-08 | 535.05 | 0 |
| 2020-08-07 | 525.47 | 0 |
| 2020-08-06 | 470.96 | 0 |
| 2020-08-05 | 407.7 | 0 |
| 2020-08-04 | 382.55 | 0 |
| 2020-08-03 | 343.06 | 0 |
| 2020-08-02 | 522.67 | 0 |
| 2020-08-01 | 492.83 | 0 |
| 2020-07-31 | 462.86 | 0 |
| 2020-07-30 | 377.8 | 0 |
| 2020-07-29 | 373.84 | 0 |
| 2020-07-28 | 414.32 | 0 |
| 2020-07-27 | 466.69 | 0 |
| 2020-07-26 | 633.2 | 0 |
| 2020-07-25 | 622.66 | 0 |
| 2020-07-24 | 405.74 | 0 |
| 2020-07-23 | 422.72 | 0 |
| 2020-07-22 | 501.52 | 0 |
| 2020-07-21 | 471.01 | 0 |
| 2020-07-20 | 456.47 | 0 |
| 2020-07-19 | 630.53 | 0 |
| 2020-07-18 | 538.33 | 0 |
| 2020-07-17 | 520.83 | 0 |
| 2020-07-16 | 524.07 | 0 |
| 2020-07-15 | 409.93 | 0 |
| 2020-07-14 | 475.1 | 0 |
| 2020-07-13 | 514.79 | 0 |
| 2020-07-12 | 592.11 | 0 |
| 2020-07-11 | 557.8 | 0 |
| 2020-07-10 | 521.9 | 0 |
| 2020-07-09 | 492.99 | 0 |
| 2020-07-08 | 501.78 | 0 |
| 2020-07-07 | 545.26 | 0 |
| 2020-07-06 | 568.36 | 0 |
| 2020-07-05 | 532.26 | 0 |
| 2020-07-04 | 537.06 | 0 |
| 2020-07-03 | 479.83 | 0 |
| 2020-07-02 | 493.87 | 0 |
| 2020-07-01 | 394.14 | 0 |
| 2020-06-30 | 706.34 | 0 |
| 2020-06-29 | 688.18 | 0 |
| 2020-06-28 | 725.37 | 0 |
| 2020-06-27 | 692.91 | 0 |
| 2020-06-26 | 732.99 | 0 |
| 2020-06-25 | 630.23 | 0 |
| 2020-06-24 | 641.34 | 0 |
| 2020-06-23 | 727.41 | 0 |
| 2020-06-22 | 733.3 | 0 |
| 2020-06-21 | 720.83 | 0 |
| 2020-06-20 | 747.36 | 0 |
| 2020-06-19 | 720.22 | 0 |
| 2020-06-18 | 600.75 | 0 |
| 2020-06-17 | 436.53 | 9.8 |
| 2020-06-16 | 457.95 | 2.7 |
| 2020-06-15 | 683.57 | 0 |
| 2020-06-14 | 750.22 | 0 |
| 2020-06-13 | 751.63 | 0 |
| 2020-06-12 | 745.48 | 0 |
| 2020-06-11 | 743.13 | 0 |
| 2020-06-10 | 717.75 | 0 |
| 2020-06-09 | 639.25 | 0 |
| 2020-06-08 | 696.88 | 0 |
| 2020-06-07 | 731.22 | 0 |
| 2020-06-06 | 745.31 | 0 |
| 2020-06-05 | 751.05 | 0 |
| 2020-06-04 | 748.83 | 0 |
| 2020-06-03 | 717.91 | 0 |
| 2020-06-02 | 729.23 | 0 |
| 2020-06-01 | 753.07 | 0 |
| 2020-05-31 | 735.73 | 0 |
| 2020-05-30 | 605.14 | 0 |
| 2020-05-29 | 535.62 | 0 |
| 2020-05-28 | 654.26 | 0 |
| 2020-05-27 | 663.52 | 0 |
| 2020-05-26 | 671.32 | 0 |
| 2020-05-25 | 777.2 | 0 |
| 2020-05-24 | 786.65 | 0 |
| 2020-05-23 | 870.58 | 0 |
| 2020-05-22 | 889.75 | 0 |
| 2020-05-21 | 846.4 | 0 |
| 2020-05-20 | 857.23 | 0 |
| 2020-05-19 | 852.03 | 0 |
| 2020-05-18 | 861.27 | 0 |
| 2020-05-17 | 908.64 | 0 |
| 2020-05-16 | 882.87 | 0 |
| 2020-05-15 | 885.69 | 0 |
| 2020-05-14 | 882.26 | 0 |
| 2020-05-13 | 874.13 | 0 |
| 2020-05-12 | 863.98 | 0 |
| 2020-05-11 | 898.02 | 0 |
| 2020-05-10 | 916.34 | 0 |
| 2020-05-09 | 895.98 | 0 |
| 2020-05-08 | 900.72 | 0 |
| 2020-05-07 | 912.58 | 0 |
| 2020-05-06 | 894.38 | 0 |
| 2020-05-05 | 891.49 | 0 |
| 2020-05-04 | 915.16 | 0 |
| 2020-05-03 | 908.89 | 0 |
| 2020-05-02 | 915.19 | 0 |
| 2020-05-01 | 913.52 | 0 |
| 2020-04-30 | 898.41 | 0 |
| 2020-04-29 | 918.52 | 0 |
| 2020-04-28 | 885.16 | 0 |
| 2020-04-27 | 866.76 | 0 |
| 2020-04-26 | 906.7 | 0 |
| 2020-04-25 | 905.37 | 0 |
| 2020-04-24 | 902.03 | 0 |
| 2020-04-23 | 892.38 | 0 |
| 2020-04-22 | 35.17 | 0 |
| 2020-04-21 | 883.88 | 0 |
| 2020-04-20 | 891.96 | 0 |
| 2020-04-19 | 877.9 | 0 |
| 2020-04-18 | 869.66 | 0 |
| 2020-04-17 | 897.1 | 0 |
| 2020-04-16 | 878.93 | 0 |
| 2020-04-15 | 895.44 | 0 |
| 2020-04-14 | 879.78 | 0 |
| 2020-04-13 | 884.58 | 0 |
| 2020-04-12 | 842.75 | 0 |
| 2020-04-11 | 878.57 | 0 |
| 2020-04-10 | 874.2 | 0 |
| 2020-04-09 | 879.94 | 0 |
| 2020-04-08 | 747.14 | 0 |
| 2020-04-07 | 652.96 | 0 |
| 2020-04-06 | 656.42 | 0 |
| 2020-04-05 | 737.64 | 0 |
| 2020-04-04 | 749.62 | 0 |
| 2020-04-03 | 375.13 | 0 |
| 2020-04-02 | 239.35 | 0 |
| 2020-04-01 | 108.69 | 0 |
| 2020-03-31 | 16.44 | 15 |
| 2020-03-30 | 33.42 | 20.9 |
| 2020-03-29 | 0 | 326.3 |
| 2020-03-28 | 0 | 326.1 |
| 2020-03-27 | 0 | 334.4 |
| 2020-03-26 | 0 | 355.4 |
| 2020-03-25 | 0 | 315.3 |
| 2020-03-24 | 0 | 199.6 |
| 2020-03-23 | 0 | 203.7 |
| 2020-03-22 | 375.81 | 24.5 |
| 2020-03-21 | 494.95 | 11.3 |
| 2020-03-20 | 246.08 | 16.3 |
| 2020-03-19 | 220.94 | 45.1 |
| 2020-03-18 | 104.2 | 47.1 |
| 2020-03-17 | 0 | 253.9 |
| 2020-03-16 | 0 | 132.6 |
| 2020-03-15 | 0 | 63.9 |
| 2020-03-14 | 0 | 134.3 |
| 2020-03-13 | 0 | 130.6 |
| 2020-03-12 | 0 | 152.2 |
| 2020-03-11 | 0 | 461 |
| 2020-03-10 | 1.22 | 613.1 |
| 2020-03-09 | 0 | 779.5 |
| 2020-03-08 | 0 | 276.6 |
| 2020-03-07 | 0 | 418 |
| 2020-03-06 | 0 | 638.1 |
| 2020-03-05 | 1.87 | 726.3 |
| 2020-03-04 | 0 | 852.4 |
| 2020-03-03 | 0.86 | 843.1 |
| 2020-03-02 | 0 | 826.7 |
| 2020-03-01 | 0 | 487.3 |
| 2020-02-29 | 0 | 769.6 |
| 2020-02-28 | 4.3 | 887.2 |
| 2020-02-27 | 0 | 988 |
| 2020-02-26 | 4.3 | 889.9 |
| 2020-02-25 | 4.03 | 623.5 |
| 2020-02-24 | 0.36 | 725.9 |
| 2020-02-23 | 0 | 497.9 |
| 2020-02-22 | 0 | 607 |
| 2020-02-21 | 1.69 | 927.7 |
| 2020-02-20 | 4.3 | 879 |
| 2020-02-19 | 4.3 | 946.8 |
| 2020-02-18 | 3.76 | 965 |
| 2020-02-17 | 4.45 | 894.9 |
| 2020-02-16 | 0 | 579.4 |
| 2020-02-15 | 0 | 676.4 |
| 2020-02-14 | 4.5 | 1023.5 |
| 2020-02-13 | 3.14 | 1174.4 |
| 2020-02-12 | 4.03 | 939.1 |
| 2020-02-11 | 4.24 | 920.1 |
| 2020-02-10 | 0 | 1090.4 |
| 2020-02-09 | 4.92 | 928.3 |
| 2020-02-08 | 4.79 | 1082.9 |
| 2020-02-07 | 0 | 1198.7 |
| 2020-02-06 | 0 | 1136.8 |
| 2020-02-05 | 0 | 1202.8 |
| 2020-02-04 | 1.32 | 980.6 |
| 2020-02-03 | 2.86 | 970.1 |
| 2020-02-02 | 0.2 | 656.5 |
| 2020-02-01 | 0.2 | 929.5 |
| 2020-01-31 | 1.81 | 1160 |
| 2020-01-30 | 0 | 1338.7 |
| 2020-01-29 | 0 | 1244.7 |
| 2020-01-28 | 0 | 1195.3 |
| 2020-01-27 | 0 | 1349.1 |
| 2020-01-26 | 0 | 1159.1 |
| 2020-01-25 | 0 | 1333.4 |
| 2020-01-24 | 0 | 1362.8 |
| 2020-01-23 | 0 | 1351.3 |
| 2020-01-22 | 0 | 1337.3 |
| 2020-01-21 | 0 | 1354.2 |
| 2020-01-20 | 0 | 1354.6 |
| 2020-01-19 | 0 | 1275.6 |
| 2020-01-18 | 0 | 1330.5 |
| 2020-01-17 | 0 | 1356.5 |
| 2020-01-16 | 0 | 1353.3 |
| 2020-01-15 | 0 | 1269.6 |
| 2020-01-14 | 0 | 1281.7 |
| 2020-01-13 | 0 | 1270 |
| 2020-01-12 | 0 | 1154.2 |
| 2020-01-11 | 0 | 1179.3 |
| 2020-01-10 | 0 | 1279.5 |
| 2020-01-09 | 0 | 1277.7 |
| 2020-01-08 | 0 | 1279.4 |
| 2020-01-07 | 0 | 1269.5 |
| 2020-01-06 | 0 | 1242.7 |
| 2020-01-05 | 0 | 1017.9 |
| 2020-01-04 | 0 | 1159.4 |
| 2020-01-03 | 0 | 1182 |
| 2020-01-02 | 0 | 1209.6 |
| 2020-01-01 | 0.02 | 968.4 |
| 2019-12-31 | 0 | 996.8 |
| 2019-12-30 | 0 | 978.6 |
| 2019-12-29 | 1.54 | 823.4 |
| 2019-12-28 | 2.93 | 758.6 |
| 2019-12-27 | 2.04 | 690.4 |
| 2019-12-26 | 3.52 | 343.7 |
| 2019-12-25 | 3.9 | 278.7 |
| 2019-12-24 | 2.95 | 554.3 |
| 2019-12-23 | 6.92 | 654 |
| 2019-12-22 | 3.27 | 400.2 |
| 2019-12-21 | 3.27 | 341.1 |
| 2019-12-20 | 3.84 | 757.7 |
| 2019-12-19 | 3.86 | 841.9 |
| 2019-12-18 | 3.85 | 872.1 |
| 2019-12-17 | 3.83 | 958.6 |
| 2019-12-16 | 2.33 | 1008 |
| 2019-12-15 | 3.69 | 792.5 |
| 2019-12-14 | 2.04 | 890.5 |
| 2019-12-13 | 0 | 1019.5 |
| 2019-12-12 | 0 | 1016.7 |
| 2019-12-11 | 0 | 1011.2 |
| 2019-12-10 | 0 | 1002.9 |
| 2019-12-09 | 2.16 | 945 |
| 2019-12-08 | 3.04 | 568.4 |
| 2019-12-07 | 3.04 | 879.2 |
| 2019-12-06 | 0 | 1017.5 |
| 2019-12-05 | 0 | 1006.1 |
| 2019-12-04 | 0 | 1007.5 |
| 2019-12-03 | 0 | 926.8 |
| 2019-12-02 | 0 | 895.4 |
| 2019-12-01 | 0.04 | 489.2 |
| 2019-11-30 | 0 | 357 |
| 2019-11-29 | 0 | 487.1 |
| 2019-11-28 | 0 | 430.5 |
| 2019-11-27 | 0 | 647 |
| 2019-11-26 | 0 | 617.6 |
| 2019-11-25 | 0 | 639.6 |
| 2019-11-24 | 0 | 229.7 |
| 2019-11-23 | 0 | 376.9 |
| 2019-11-22 | 0 | 612.8 |
| 2019-11-21 | 0 | 690.4 |
| 2019-11-20 | 0 | 703.4 |
| 2019-11-19 | 0 | 835.6 |
| 2019-11-18 | 0 | 779.9 |
| 2019-11-17 | 0 | 367.8 |
| 2019-11-16 | 0 | 370 |
| 2019-11-15 | 0 | 557.7 |
| 2019-11-14 | 0 | 715.8 |
| 2019-11-13 | 0 | 684.6 |
| 2019-11-12 | 0 | 538.6 |
| 2019-11-11 | 0 | 459.1 |
| 2019-11-10 | 4.32 | 6.7 |
| 2019-11-09 | 4.32 | 38.7 |
| 2019-11-08 | 4.32 | 81 |
| 2019-11-07 | 4.32 | 134.7 |
| 2019-11-06 | 0 | 149.1 |
| 2019-11-05 | 5.04 | 67.8 |
| 2019-11-04 | 5.04 | 13.4 |
| 2019-11-03 | 49.68 | 0 |
| 2019-11-02 | 42.78 | 0 |
| 2019-11-01 | 53.12 | 0 |
| 2019-10-31 | 126.57 | 6 |
| 2019-10-30 | 134.39 | 4.8 |
| 2019-10-29 | 117.34 | 2.4 |
| 2019-10-28 | 130.13 | 2.1 |
| 2019-10-27 | 134.32 | 0 |
| 2019-10-26 | 134.32 | 0 |
| 2019-10-25 | 128.23 | 0.7 |
| 2019-10-24 | 127.68 | 0.7 |
| 2019-10-23 | 116.69 | 1.9 |
| 2019-10-22 | 121.8 | 4.2 |
| 2019-10-21 | 125.79 | 6.2 |
| 2019-10-20 | 156.69 | 0 |
| 2019-10-19 | 145.65 | 0 |
| 2019-10-18 | 140.78 | 2.8 |
| 2019-10-17 | 112.5 | 0 |
| 2019-10-16 | 116.6 | 0 |
| 2019-10-15 | 138.02 | 0 |
| 2019-10-14 | 134.93 | 0 |
| 2019-10-13 | 159.43 | 0 |
| 2019-10-12 | 157.38 | 0 |
| 2019-10-11 | 142.9 | 0 |
| 2019-10-10 | 133.99 | 0.9 |
| 2019-10-09 | 136.69 | 0 |
| 2019-10-08 | 135.59 | 0 |
| 2019-10-07 | 103.13 | 2.9 |
| 2019-10-06 | 133.27 | 0 |
| 2019-10-05 | 132.08 | 0 |
| 2019-10-04 | 74.63 | 4.4 |
| 2019-10-03 | 139.27 | 0 |
| 2019-10-02 | 118.17 | 0 |
| 2019-10-01 | 132.63 | 0 |
| 2019-09-30 | 165.95 | 0 |
| 2019-09-29 | 388.86 | 0 |
| 2019-09-28 | 387.18 | 0 |
| 2019-09-27 | 351.98 | 0 |
| 2019-09-26 | 371.54 | 0 |
| 2019-09-25 | 376.32 | 0 |
| 2019-09-24 | 367.58 | 0 |
| 2019-09-23 | 380.6 | 0 |
| 2019-09-22 | 380.82 | 0 |
| 2019-09-21 | 371.25 | 0 |
| 2019-09-20 | 379.09 | 0 |
| 2019-09-19 | 360.68 | 0 |
| 2019-09-18 | 376.91 | 0 |
| 2019-09-17 | 385.1 | 0 |
| 2019-09-16 | 409.86 | 0 |
| 2019-09-15 | 428.27 | 0 |
| 2019-09-14 | 424.04 | 0 |
| 2019-09-13 | 415.73 | 0 |
| 2019-09-12 | 407.99 | 0 |
| 2019-09-11 | 411.12 | 0 |
| 2019-09-10 | 412.04 | 0 |
| 2019-09-09 | 426.86 | 0 |
| 2019-09-08 | 452.8 | 0 |
| 2019-09-07 | 429.56 | 0 |
| 2019-09-06 | 414.35 | 0 |
| 2019-09-05 | 407.89 | 0 |
| 2019-09-04 | 399.11 | 0 |
| 2019-09-03 | 398.38 | 0 |
| 2019-09-02 | 345.63 | 0 |
| 2019-09-01 | 528.47 | 0 |
| 2019-08-31 | 520.46 | 0 |
| 2019-08-30 | 513.08 | 0 |
| 2019-08-29 | 481.78 | 0 |
| 2019-08-28 | 489.46 | 0 |
| 2019-08-27 | 474.41 | 0 |
| 2019-08-26 | 561.67 | 0 |
| 2019-08-25 | 571.93 | 0 |
| 2019-08-24 | 573.91 | 0 |
| 2019-08-23 | 575.24 | 0 |
| 2019-08-22 | 578.42 | 0 |
| 2019-08-21 | 580.11 | 0 |
| 2019-08-20 | 580.27 | 0 |
| 2019-08-19 | 579.34 | 0 |
| 2019-08-18 | 605.82 | 0 |
| 2019-08-17 | 600.12 | 0 |
| 2019-08-16 | 611.4 | 0 |
| 2019-08-15 | 608.48 | 0 |
| 2019-08-14 | 590.29 | 0 |
| 2019-08-13 | 570.63 | 0 |
| 2019-08-12 | 582.12 | 0 |
| 2019-08-11 | 601.37 | 0 |
| 2019-08-10 | 599.18 | 0 |
| 2019-08-09 | 607.13 | 0 |
| 2019-08-08 | 611.1 | 0 |
| 2019-08-07 | 578.74 | 0 |
| 2019-08-06 | 579.26 | 0 |
| 2019-08-05 | 577.97 | 0 |
| 2019-08-04 | 637.9 | 0 |
| 2019-08-03 | 725.56 | 0 |
| 2019-08-02 | 741.52 | 0 |
| 2019-08-01 | 702.14 | 0 |
| 2019-07-31 | 722.21 | 0 |
| 2019-07-30 | 768.24 | 0 |
| 2019-07-29 | 658.41 | 0 |
| 2019-07-28 | 756.4 | 0 |
| 2019-07-27 | 680.55 | 0 |
| 2019-07-26 | 615.29 | 0 |
| 2019-07-25 | 644.05 | 0 |
| 2019-07-24 | 638.16 | 0 |
| 2019-07-23 | 693.67 | 0 |
| 2019-07-22 | 646.53 | 0 |
| 2019-07-21 | 701.64 | 0 |
| 2019-07-20 | 707.7 | 0 |
| 2019-07-19 | 706.58 | 0 |
| 2019-07-18 | 697.15 | 0 |
| 2019-07-17 | 700.75 | 0 |
| 2019-07-16 | 700.8 | 0 |
| 2019-07-15 | 695.16 | 0 |
| 2019-07-14 | 703.66 | 0 |
| 2019-07-13 | 700.13 | 0 |
| 2019-07-12 | 755.5 | 0 |
| 2019-07-11 | 750.9 | 0 |
| 2019-07-10 | 707.77 | 0 |
| 2019-07-09 | 601.81 | 0 |
| 2019-07-08 | 742.13 | 0 |
| 2019-07-07 | 759.32 | 0 |
| 2019-07-06 | 764.75 | 0 |
| 2019-07-05 | 644.95 | 0 |
| 2019-07-04 | 453.83 | 0 |
| 2019-07-03 | 526.39 | 0 |
| 2019-07-02 | 463.78 | 0 |
| 2019-07-01 | 684.41 | 0 |
| 2019-06-30 | 862.1 | 0 |
| 2019-06-29 | 845.39 | 0 |
| 2019-06-28 | 692 | 0 |
| 2019-06-27 | 728.65 | 0 |
| 2019-06-26 | 746.89 | 0 |
| 2019-06-25 | 775.54 | 0 |
| 2019-06-24 | 830.04 | 0 |
| 2019-06-23 | 883.15 | 0 |
| 2019-06-22 | 775.25 | 0 |
| 2019-06-21 | 778.57 | 0 |
| 2019-06-20 | 834.17 | 0 |
| 2019-06-19 | 591.65 | 0 |
| 2019-06-18 | 621.12 | 0 |
| 2019-06-17 | 884.99 | 0 |
| 2019-06-16 | 902.37 | 0 |
| 2019-06-15 | 870.23 | 0 |
| 2019-06-14 | 897.81 | 0 |
| 2019-06-13 | 816.7 | 0 |
| 2019-06-12 | 828.86 | 0 |
| 2019-06-11 | 890.79 | 0 |
| 2019-06-10 | 835.71 | 0 |
| 2019-06-09 | 894.43 | 0 |
| 2019-06-08 | 1005.19 | 0 |
| 2019-06-07 | 945.95 | 0 |
| 2019-06-06 | 864.33 | 0 |
| 2019-06-05 | 828.24 | 0 |
| 2019-06-04 | 718.17 | 0 |
| 2019-06-03 | 757.22 | 0 |
| 2019-06-02 | 1014.9 | 0 |
| 2019-06-01 | 1014.64 | 0 |
| 2019-05-31 | 967.14 | 0 |
| 2019-05-30 | 920.63 | 0 |
| 2019-05-29 | 919.38 | 0 |
| 2019-05-28 | 885.79 | 0 |
| 2019-05-27 | 820.87 | 0 |
| 2019-05-26 | 1009.45 | 0 |
| 2019-05-25 | 976.57 | 0 |
| 2019-05-24 | 935.12 | 0 |
| 2019-05-23 | 876.49 | 0 |
| 2019-05-22 | 910.32 | 0 |
| 2019-05-21 | 753.79 | 0 |
| 2019-05-20 | 759.19 | 0 |
| 2019-05-19 | 866.25 | 0 |
| 2019-05-18 | 871.98 | 0 |
| 2019-05-17 | 796.38 | 0 |
| 2019-05-16 | 591.35 | 0 |
| 2019-05-15 | 483.99 | 0 |
| 2019-05-14 | 563.58 | 0 |
| 2019-05-13 | 564.84 | 0 |
| 2019-05-12 | 953.03 | 0 |
| 2019-05-11 | 957.66 | 0 |
| 2019-05-10 | 761.63 | 0 |
| 2019-05-09 | 634.65 | 0 |
| 2019-05-08 | 411.15 | 0 |
| 2019-05-07 | 442.59 | 0 |
| 2019-05-06 | 434.73 | 0 |
| 2019-05-05 | 772.15 | 0 |
| 2019-05-04 | 801.28 | 0 |
| 2019-05-03 | 668.16 | 0 |
| 2019-05-02 | 646.06 | 0 |
| 2019-05-01 | 881.65 | 0 |
| 2019-04-30 | 732.82 | 0 |
| 2019-04-29 | 537.89 | 0 |
| 2019-04-28 | 812.57 | 0 |
| 2019-04-27 | 888.11 | 0 |
| 2019-04-26 | 936.38 | 0 |
| 2019-04-25 | 998.13 | 0 |
| 2019-04-24 | 793.48 | 0 |
| 2019-04-23 | 724.39 | 0 |
| 2019-04-22 | 932.85 | 0 |
| 2019-04-21 | 942 | 0 |
| 2019-04-20 | 911.28 | 0 |
| 2019-04-19 | 804.26 | 0 |
| 2019-04-18 | 747.46 | 0 |
| 2019-04-17 | 562.13 | 0 |
| 2019-04-16 | 469.09 | 0 |
| 2019-04-15 | 400.64 | 0 |
| 2019-04-14 | 523.76 | 0 |
| 2019-04-13 | 511.24 | 0 |
| 2019-04-12 | 308.31 | 0 |
| 2019-04-11 | 232.64 | 0 |
| 2019-04-10 | 364 | 0 |
| 2019-04-09 | 267.12 | 0 |
| 2019-04-08 | 174.05 | 0 |
| 2019-04-07 | 521.25 | 0 |
| 2019-04-06 | 547.47 | 0 |
| 2019-04-05 | 198.94 | 0 |
| 2019-04-04 | 196.29 | 0 |
| 2019-04-03 | 264.62 | 0 |
| 2019-04-02 | 381.76 | 0 |
| 2019-04-01 | 387.77 | 0 |
| 2019-03-31 | 59.35 | 0 |
| 2019-03-30 | 58.85 | 0 |
| 2019-03-29 | 45.31 | 31.7 |
| 2019-03-28 | 0 | 198.2 |
| 2019-03-27 | 2.15 | 221.6 |
| 2019-03-26 | 0 | 217.9 |
| 2019-03-25 | 13.2 | 37.4 |
| 2019-03-24 | 179.86 | 0 |
| 2019-03-23 | 160.56 | 0.1 |
| 2019-03-22 | 0 | 81.1 |
| 2019-03-21 | 0 | 360.6 |
| 2019-03-20 | 0 | 487.7 |
| 2019-03-19 | 11.49 | 582 |
| 2019-03-18 | 10.1 | 218.9 |
| 2019-03-17 | 91.25 | 23.9 |
| 2019-03-16 | 113.21 | 23.4 |
| 2019-03-15 | 0 | 211.7 |
| 2019-03-14 | 0 | 623.3 |
| 2019-03-13 | 0 | 569.4 |
| 2019-03-12 | 0 | 363.9 |
| 2019-03-11 | 0 | 129.9 |
| 2019-03-10 | 151.87 | 14.8 |
| 2019-03-09 | 47.1 | 20.1 |
| 2019-03-08 | 1.44 | 167.9 |
| 2019-03-07 | 0 | 412.4 |
| 2019-03-06 | 0 | 553.5 |
| 2019-03-05 | 0 | 495.7 |
| 2019-03-04 | 0 | 497.5 |
| 2019-03-03 | 0 | 173 |
| 2019-03-02 | 0 | 232.2 |
| 2019-03-01 | 12 | 425.8 |
| 2019-02-28 | 10.85 | 755.6 |
| 2019-02-27 | 12.96 | 708.6 |
| 2019-02-26 | 12.96 | 955.1 |
| 2019-02-25 | 13.15 | 1072.3 |
| 2019-02-24 | 13.15 | 991.8 |
| 2019-02-23 | 13.15 | 871.4 |
| 2019-02-22 | 13.44 | 1011.5 |
| 2019-02-21 | 14.21 | 986.7 |
| 2019-02-20 | 0 | 1017.8 |
| 2019-02-19 | 0 | 1010 |
| 2019-02-18 | 4.8 | 966.1 |
| 2019-02-17 | 26.88 | 738.1 |
| 2019-02-16 | 26.88 | 952.5 |
| 2019-02-15 | 27.36 | 985.5 |
| 2019-02-14 | 26.11 | 1111.5 |
| 2019-02-13 | 16.32 | 1113 |
| 2019-02-12 | 0 | 957.4 |
| 2019-02-11 | 0 | 978.4 |
| 2019-02-10 | 30.24 | 725 |
| 2019-02-09 | 19.2 | 904.1 |
| 2019-02-08 | 17.72 | 1126.3 |
| 2019-02-07 | 11.91 | 1098.6 |
| 2019-02-06 | 2.63 | 1055.2 |
| 2019-02-05 | 0 | 1104.3 |
| 2019-02-04 | 0 | 1097.2 |
| 2019-02-03 | 0 | 822 |
| 2019-02-02 | 0 | 946.8 |
| 2019-02-01 | 0 | 1090.7 |
| 2019-01-31 | 30.11 | 1264.1 |
| 2019-01-30 | 26.75 | 1283.2 |
| 2019-01-29 | 22.91 | 1257.5 |
| 2019-01-28 | 19.07 | 1281.2 |
| 2019-01-27 | 14.04 | 1152.9 |
| 2019-01-26 | 13.5 | 1248.3 |
| 2019-01-25 | 11.65 | 1277.3 |
| 2019-01-24 | 8.5 | 1282.7 |
| 2019-01-23 | 16.46 | 1265.8 |
| 2019-01-22 | 0 | 1286.7 |
| 2019-01-21 | 18.45 | 1261.3 |
| 2019-01-20 | 17.28 | 1193.8 |
| 2019-01-19 | 17.28 | 1180.9 |
| 2019-01-18 | 13.92 | 1274.6 |
| 2019-01-17 | 12 | 1228.8 |
| 2019-01-16 | 5.76 | 1271.1 |
| 2019-01-15 | 0 | 1204.3 |
| 2019-01-14 | 26.77 | 114.2 |
| 2019-01-13 | 40.82 | 90.3 |
| 2019-01-12 | 36.85 | 111.4 |
| 2019-01-11 | 31.05 | 116.2 |
| 2019-01-10 | 0 | 1223.1 |
| 2019-01-09 | 0 | 1259 |
| 2019-01-08 | 0 | 1249.7 |
| 2019-01-07 | 4.54 | 1223.4 |
| 2019-01-06 | 14.15 | 1226.6 |
| 2019-01-05 | 9.85 | 1222.5 |
| 2019-01-04 | 10.51 | 1215 |
| 2019-01-03 | 12.33 | 1194.6 |
| 2019-01-02 | 11.75 | 1108.7 |
| 2019-01-01 | 11.75 | 756.8 |
| 2018-12-31 | 11.75 | 886.2 |
| 2018-12-30 | 11.75 | 831.3 |
| 2018-12-29 | 12.71 | 889.6 |
| 2018-12-28 | 9.89 | 956.1 |
| 2018-12-27 | 0 | 977.3 |
| 2018-12-26 | 4.03 | 833 |
| 2018-12-25 | 16.32 | 580.3 |
| 2018-12-24 | 12.48 | 588.6 |
| 2018-12-23 | 17.28 | 734.9 |
| 2018-12-22 | 17.28 | 780.6 |
| 2018-12-21 | 0.48 | 901.2 |
| 2018-12-20 | 0.48 | 985.3 |
| 2018-12-19 | 0.48 | 1058.1 |
| 2018-12-18 | 0.48 | 1046.6 |
| 2018-12-17 | 10.94 | 1058 |
| 2018-12-16 | 20.74 | 1005.4 |
| 2018-12-15 | 22.36 | 952.3 |
| 2018-12-14 | 22.08 | 1080.2 |
| 2018-12-13 | 16.56 | 1075.5 |
| 2018-12-12 | 2.16 | 1009.9 |
| 2018-12-11 | 0.29 | 1011.3 |
| 2018-12-10 | 0.24 | 987.5 |
| 2018-12-09 | 0.48 | 527.9 |
| 2018-12-08 | 0.48 | 540.2 |
| 2018-12-07 | 0.53 | 971.6 |
| 2018-12-06 | 0.54 | 951.1 |
| 2018-12-05 | 0 | 983.8 |
| 2018-12-04 | 0 | 926.7 |
| 2018-12-03 | 0 | 1005.1 |
| 2018-12-02 | 0 | 749.8 |
| 2018-12-01 | 0 | 888.4 |
| 2018-11-30 | 0 | 855.2 |
| 2018-11-29 | 0 | 920.9 |
| 2018-11-28 | 0 | 782.8 |
| 2018-11-27 | 0 | 800 |
| 2018-11-26 | 0 | 758.3 |
| 2018-11-25 | 0 | 521.8 |
| 2018-11-24 | 0 | 628.5 |
| 2018-11-23 | 0 | 838.6 |
| 2018-11-22 | 0 | 799.6 |
| 2018-11-21 | 0 | 931.8 |
| 2018-11-20 | 0 | 922.7 |
| 2018-11-19 | 0 | 932 |
| 2018-11-18 | 0 | 667 |
| 2018-11-17 | 0 | 648.3 |
| 2018-11-16 | 0 | 718.2 |
| 2018-11-15 | 0 | 663.6 |
| 2018-11-14 | 0 | 498.2 |
| 2018-11-13 | 0 | 512.3 |
| 2018-11-12 | 0 | 466 |
| 2018-11-11 | 0 | 154.5 |
| 2018-11-10 | 0 | 188.5 |
| 2018-11-09 | 23.54 | 59.3 |
| 2018-11-08 | 0 | 414 |
| 2018-11-07 | 0 | 389.4 |
| 2018-11-06 | 0 | 405.1 |
| 2018-11-05 | 23.54 | 55 |
| 2018-11-04 | 0 | 186.7 |
| 2018-11-03 | 0 | 191.6 |
| 2018-11-02 | 0 | 184.5 |
| 2018-11-01 | 0 | 233.7 |
| 2018-10-31 | 0 | 231.2 |
| 2018-10-30 | 0 | 234.8 |
| 2018-10-29 | 0 | 94.9 |
| 2018-10-28 | 54.65 | 3.8 |
| 2018-10-27 | 54.65 | 0 |
| 2018-10-26 | 54.65 | 0 |
| 2018-10-25 | 48.08 | 0 |
| 2018-10-24 | 35.1 | 0 |
| 2018-10-23 | 0.04 | 0 |
| 2018-10-22 | 42.93 | 0.1 |
| 2018-10-21 | 170.31 | 2.8 |
| 2018-10-20 | 193.04 | 0 |
| 2018-10-19 | 128.91 | 0 |
| 2018-10-18 | 153.96 | 0 |
| 2018-10-17 | 75.15 | 0 |
| 2018-10-16 | 61.94 | 0 |
| 2018-10-15 | 174.08 | 0 |
| 2018-10-14 | 400.51 | 0 |
| 2018-10-13 | 419.88 | 0 |
| 2018-10-12 | 210.6 | 0 |
| 2018-10-11 | 153.68 | 0 |
| 2018-10-10 | 169.02 | 0 |
| 2018-10-09 | 155.81 | 0 |
| 2018-10-08 | 188.99 | 0 |
| 2018-10-07 | 383.11 | 0 |
| 2018-10-06 | 290.77 | 0 |
| 2018-10-05 | 165.72 | 0 |
| 2018-10-04 | 136.85 | 0 |
| 2018-10-03 | 120.55 | 0 |
| 2018-10-02 | 83.32 | 0 |
| 2018-10-01 | 220.56 | 0 |
| 2018-09-30 | 452.68 | 0 |
| 2018-09-29 | 355.61 | 0 |
| 2018-09-28 | 266.43 | 0 |
| 2018-09-27 | 217.02 | 0 |
| 2018-09-26 | 201.14 | 0 |
| 2018-09-25 | 184.59 | 0 |
| 2018-09-24 | 397.48 | 0 |
| 2018-09-23 | 418.39 | 0 |
| 2018-09-22 | 344.59 | 0 |
| 2018-09-21 | 450.86 | 0 |
| 2018-09-20 | 386.21 | 0 |
| 2018-09-19 | 374.44 | 0 |
| 2018-09-18 | 405.05 | 0 |
| 2018-09-17 | 358.49 | 0 |
| 2018-09-16 | 453.98 | 0 |
| 2018-09-15 | 429.83 | 0 |
| 2018-09-14 | 448.4 | 0 |
| 2018-09-13 | 349.9 | 0 |
| 2018-09-12 | 354.38 | 0 |
| 2018-09-11 | 460.7 | 0 |
| 2018-09-10 | 518.22 | 0 |
| 2018-09-09 | 572.19 | 0 |
| 2018-09-08 | 576.12 | 0 |
| 2018-09-07 | 567.96 | 0 |
| 2018-09-06 | 518.04 | 0 |
| 2018-09-05 | 518.61 | 0 |
| 2018-09-04 | 492.41 | 0 |
| 2018-09-03 | 495.32 | 0 |
| 2018-09-02 | 611.82 | 0 |
| 2018-09-01 | 630.06 | 0 |
| 2018-08-31 | 610.09 | 0 |
| 2018-08-30 | 555.86 | 0 |
| 2018-08-29 | 494.44 | 0 |
| 2018-08-28 | 580.49 | 0 |
| 2018-08-27 | 596.55 | 0 |
| 2018-08-26 | 613.54 | 0 |
| 2018-08-25 | 604 | 0 |
| 2018-08-24 | 632.76 | 0 |
| 2018-08-23 | 621.48 | 0 |
| 2018-08-22 | 641.55 | 0 |
| 2018-08-21 | 637.34 | 0 |
| 2018-08-20 | 649.31 | 0 |
| 2018-08-19 | 656.64 | 0 |
| 2018-08-18 | 670.58 | 0 |
| 2018-08-17 | 730.52 | 0 |
| 2018-08-16 | 716.77 | 0 |
| 2018-08-15 | 727.38 | 0 |
| 2018-08-14 | 731.33 | 0 |
| 2018-08-13 | 615.58 | 0 |
| 2018-08-12 | 668.64 | 0 |
| 2018-08-11 | 629.51 | 0 |
| 2018-08-10 | 645.21 | 0 |
| 2018-08-09 | 460.1 | 0 |
| 2018-08-08 | 287.89 | 0 |
| 2018-08-07 | 201.39 | 0 |
| 2018-08-06 | 232.99 | 0 |
| 2018-08-05 | 643.83 | 0 |
| 2018-08-04 | 614.3 | 0 |
| 2018-08-03 | 646.89 | 0 |
| 2018-08-02 | 476.16 | 0 |
| 2018-08-01 | 443.39 | 0 |
| 2018-07-31 | 532.63 | 0 |
| 2018-07-30 | 724.91 | 0 |
| 2018-07-29 | 791.18 | 0 |
| 2018-07-28 | 802.09 | 0 |
| 2018-07-27 | 734.88 | 0 |
| 2018-07-26 | 602.92 | 0 |
| 2018-07-25 | 655.52 | 0 |
| 2018-07-24 | 685.79 | 0 |
| 2018-07-23 | 772.62 | 0 |
| 2018-07-22 | 908.7 | 0 |
| 2018-07-21 | 905.5 | 0 |
| 2018-07-20 | 696.83 | 0 |
| 2018-07-19 | 659.75 | 0 |
| 2018-07-18 | 668.73 | 0 |
| 2018-07-17 | 636.34 | 0 |
| 2018-07-16 | 632.68 | 0 |
| 2018-07-15 | 816.84 | 0 |
| 2018-07-14 | 822.93 | 0 |
| 2018-07-13 | 424.44 | 0 |
| 2018-07-12 | 394.25 | 0 |
| 2018-07-11 | 330.23 | 0 |
| 2018-07-10 | 274.8 | 0 |
| 2018-07-09 | 459.07 | 0 |
| 2018-07-08 | 877.55 | 0 |
| 2018-07-07 | 969.79 | 0 |
| 2018-07-06 | 667.19 | 0 |
| 2018-07-05 | 544.96 | 0 |
| 2018-07-04 | 448.78 | 0 |
| 2018-07-03 | 441.77 | 0 |
| 2018-07-02 | 622.48 | 0 |
| 2018-07-01 | 918.77 | 0 |
| 2018-06-30 | 959.84 | 0 |
| 2018-06-29 | 780.59 | 0 |
| 2018-06-28 | 818.31 | 0 |
| 2018-06-27 | 773.68 | 0 |
| 2018-06-26 | 710.04 | 0 |
| 2018-06-25 | 797.85 | 0 |
| 2018-06-24 | 976.67 | 0 |
| 2018-06-23 | 1027.63 | 0 |
| 2018-06-22 | 669.04 | 0 |
| 2018-06-21 | 452.41 | 0 |
| 2018-06-20 | 492.48 | 0 |
| 2018-06-19 | 550.82 | 0 |
| 2018-06-18 | 638.01 | 0 |
| 2018-06-17 | 918.35 | 0 |
| 2018-06-16 | 948.73 | 0 |
| 2018-06-15 | 720.53 | 0 |
| 2018-06-14 | 796.11 | 0 |
| 2018-06-13 | 744.67 | 0 |
| 2018-06-12 | 668.51 | 0 |
| 2018-06-11 | 682.07 | 0 |
| 2018-06-10 | 975.33 | 0 |
| 2018-06-09 | 955.29 | 0 |
| 2018-06-08 | 767.42 | 0 |
| 2018-06-07 | 756.05 | 0 |
| 2018-06-06 | 685.55 | 0 |
| 2018-06-05 | 699.47 | 0 |
| 2018-06-04 | 664.29 | 0 |
| 2018-06-03 | 892.39 | 0 |
| 2018-06-02 | 954.85 | 0 |
| 2018-06-01 | 888.86 | 0 |
| 2018-05-31 | 871.52 | 0 |
| 2018-05-30 | 879.12 | 0 |
| 2018-05-29 | 946.54 | 0 |
| 2018-05-28 | 830 | 0 |
| 2018-05-27 | 1052.82 | 0 |
| 2018-05-26 | 1053.97 | 0 |
| 2018-05-25 | 903.99 | 0 |
| 2018-05-24 | 797.69 | 0 |
| 2018-05-23 | 611.56 | 0 |
| 2018-05-22 | 641.45 | 0 |
| 2018-05-21 | 805.33 | 0 |
| 2018-05-20 | 1161.51 | 0 |
| 2018-05-19 | 1147.23 | 0 |
| 2018-05-18 | 909.02 | 0 |
| 2018-05-17 | 968.71 | 0 |
| 2018-05-16 | 1016.5 | 0 |
| 2018-05-15 | 956.88 | 0 |
| 2018-05-14 | 952.08 | 0 |
| 2018-05-13 | 1131.18 | 0 |
| 2018-05-12 | 1064.99 | 0 |
| 2018-05-11 | 959.73 | 0 |
| 2018-05-10 | 889.05 | 0 |
| 2018-05-09 | 905.75 | 0 |
| 2018-05-08 | 849.54 | 0 |
| 2018-05-07 | 815.69 | 0 |
| 2018-05-06 | 1048.21 | 0 |
| 2018-05-05 | 978.72 | 0 |
| 2018-05-04 | 733.24 | 0 |
| 2018-05-03 | 622.03 | 0 |
| 2018-05-02 | 657.95 | 0 |
| 2018-05-01 | 1051.16 | 0 |
| 2018-04-30 | 891.01 | 0 |
| 2018-04-29 | 1097.81 | 0 |
| 2018-04-28 | 1084.35 | 0 |
| 2018-04-27 | 906.56 | 0 |
| 2018-04-26 | 740.4 | 0 |
| 2018-04-25 | 845.02 | 0 |
| 2018-04-24 | 541.48 | 0 |
| 2018-04-23 | 830.09 | 0 |
| 2018-04-22 | 1024.71 | 0 |
| 2018-04-21 | 1010.56 | 0 |
| 2018-04-20 | 995.34 | 0 |
| 2018-04-19 | 632.48 | 0 |
| 2018-04-18 | 668.4 | 0 |
| 2018-04-17 | 465.51 | 0 |
| 2018-04-16 | 554.04 | 0 |
| 2018-04-15 | 795.09 | 0 |
| 2018-04-14 | 802.05 | 0 |
| 2018-04-13 | 388.07 | 0 |
| 2018-04-12 | 180.35 | 0 |
| 2018-04-11 | 208.18 | 0 |
| 2018-04-10 | 236.26 | 0 |
| 2018-04-09 | 351.41 | 0.2 |
| 2018-04-08 | 832.56 | 0 |
| 2018-04-07 | 686.6 | 0 |
| 2018-04-06 | 399.62 | 0 |
| 2018-04-05 | 144.76 | 0 |
| 2018-04-04 | 10.45 | 0 |
| 2018-04-03 | 97.92 | 0 |
| 2018-04-02 | 353.23 | 0 |
| 2018-04-01 | 488.56 | 0 |
| 2018-03-31 | 385.62 | 0 |
| 2018-03-30 | 252.6 | 21.8 |
| 2018-03-29 | 45.88 | 25.2 |
| 2018-03-28 | 0 | 246.5 |
| 2018-03-27 | 0 | 422.5 |
| 2018-03-26 | 0 | 496.9 |
| 2018-03-25 | 0 | 137.9 |
| 2018-03-24 | 0 | 337.7 |
| 2018-03-23 | 0 | 571.2 |
| 2018-03-22 | 0 | 631.6 |
| 2018-03-21 | 0 | 663.2 |
| 2018-03-20 | 0 | 664.2 |
| 2018-03-19 | 0 | 661.7 |
| 2018-03-18 | 0 | 326.3 |
| 2018-03-17 | 0 | 361.6 |
| 2018-03-16 | 0 | 566.2 |
| 2018-03-15 | 0 | 797.2 |
| 2018-03-14 | 0 | 646.5 |
| 2018-03-13 | 0 | 535.3 |
| 2018-03-12 | 0 | 621.2 |
| 2018-03-11 | 0 | 269.7 |
| 2018-03-10 | 0 | 314.1 |
| 2018-03-09 | 0 | 604 |
| 2018-03-08 | 0 | 687.2 |
| 2018-03-07 | 0 | 744.7 |
| 2018-03-06 | 0 | 737.8 |
| 2018-03-05 | 0 | 745 |
| 2018-03-04 | 0 | 803.4 |
| 2018-03-03 | 0 | 811.7 |
| 2018-03-02 | 0 | 936.1 |
| 2018-03-01 | 0 | 1135.2 |
| 2018-02-28 | 0 | 1129.5 |
| 2018-02-27 | 0 | 1127 |
| 2018-02-26 | 0 | 1128.8 |
| 2018-02-25 | 0 | 1083.8 |
| 2018-02-24 | 0 | 922.6 |
| 2018-02-23 | 0 | 1092.8 |
| 2018-02-22 | 0 | 1090.6 |
| 2018-02-21 | 0 | 1094.3 |
| 2018-02-20 | 0 | 1065.5 |
| 2018-02-19 | 0 | 1066.8 |
| 2018-02-18 | 0 | 817.7 |
| 2018-02-17 | 0 | 951.9 |
| 2018-02-16 | 0 | 1027 |
| 2018-02-15 | 0 | 1075.2 |
| 2018-02-14 | 0 | 1134.4 |
| 2018-02-13 | 0 | 1133 |
| 2018-02-12 | 0 | 1160.7 |
| 2018-02-11 | 0 | 802.6 |
| 2018-02-10 | 0 | 837.7 |
| 2018-02-09 | 0 | 1064.6 |
| 2018-02-08 | 0 | 1168.3 |
| 2018-02-07 | 0 | 1211.1 |
| 2018-02-06 | 0 | 1209.7 |
| 2018-02-05 | 0 | 1167.8 |
| 2018-02-04 | 0 | 802.9 |
| 2018-02-03 | 0 | 834.7 |
| 2018-02-02 | 0 | 1060.6 |
| 2018-02-01 | 0 | 1167.4 |
| 2018-01-31 | 0 | 1252 |
| 2018-01-30 | 0 | 1282.9 |
| 2018-01-29 | 0 | 1308.5 |
| 2018-01-28 | 0 | 846.4 |
| 2018-01-27 | 0 | 941.4 |
| 2018-01-26 | 0 | 1243 |
| 2018-01-25 | 0 | 1242.7 |
| 2018-01-24 | 0 | 1282.6 |
| 2018-01-23 | 0 | 1292.2 |
| 2018-01-22 | 0 | 1226.2 |
| 2018-01-21 | 0 | 687.8 |
| 2018-01-20 | 0 | 946 |
| 2018-01-19 | 0 | 1177.4 |
| 2018-01-18 | 0 | 1245 |
| 2018-01-17 | 0 | 1307.6 |
| 2018-01-16 | 0 | 1320.2 |
| 2018-01-15 | 0 | 1264.1 |
| 2018-01-14 | 0 | 943.6 |
| 2018-01-13 | 0 | 887.4 |
| 2018-01-12 | 0 | 1120.5 |
| 2018-01-11 | 0 | 1158.4 |
| 2018-01-10 | 0 | 1013.3 |
| 2018-01-09 | 0 | 1005.4 |
| 2018-01-08 | 0 | 916.2 |
| 2018-01-07 | 0 | 502.9 |
| 2018-01-06 | 0 | 452.3 |
| 2018-01-05 | 0 | 815 |
| 2018-01-04 | 0 | 874.1 |
| 2018-01-03 | 0 | 873.3 |
| 2018-01-02 | 0 | 674.9 |
| 2018-01-01 | 0 | 605.5 |